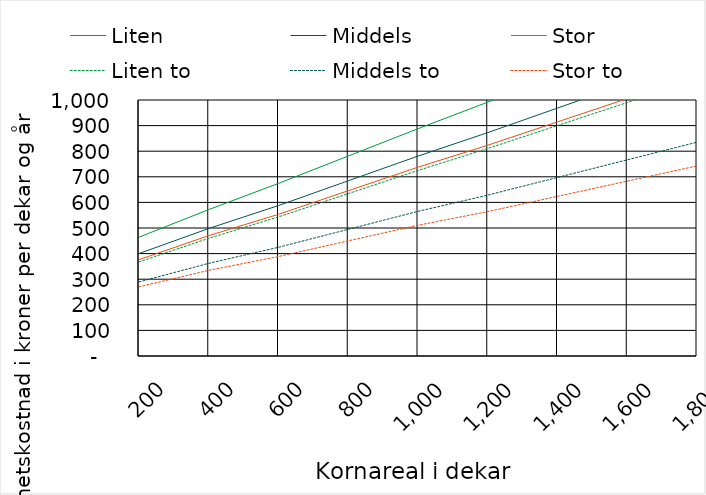
| Category | Liten | Middels | Stor | Liten to | Middels to | Stor to |
|---|---|---|---|---|---|---|
| 200.0 | 464.203 | 400.222 | 376.381 | 367.605 | 289.402 | 270.373 |
| 400.0 | 571.911 | 498.166 | 470.131 | 459.705 | 361.974 | 334.556 |
| 600.0 | 674.248 | 587.735 | 553.481 | 543.458 | 424.662 | 388.608 |
| 800.0 | 781.139 | 684.389 | 645.588 | 634.166 | 494.897 | 449.747 |
| 1000.0 | 887.909 | 780.923 | 737.574 | 724.753 | 565.011 | 510.766 |
| 1200.0 | 991.709 | 872.608 | 823.338 | 810.478 | 628.453 | 564.107 |
| 1400.0 | 1098.001 | 968.462 | 914.485 | 900.351 | 697.449 | 623.689 |
| 1600.0 | 1204.173 | 1064.194 | 1005.511 | 990.103 | 766.323 | 683.151 |
| 1800.0 | 1310.223 | 1159.806 | 1096.416 | 1079.734 | 835.077 | 742.491 |